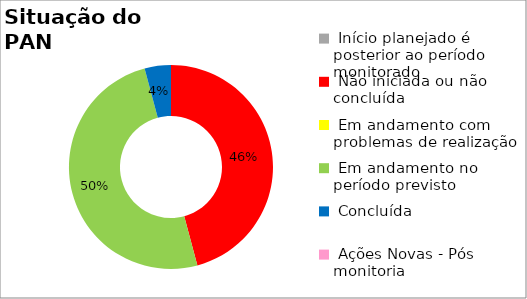
| Category | Series 0 |
|---|---|
|  Início planejado é posterior ao período monitorado | 0 |
|  Não iniciada ou não concluída | 0.458 |
|  Em andamento com problemas de realização | 0 |
|  Em andamento no período previsto  | 0.5 |
|  Concluída | 0.042 |
|  Ações Novas - Pós monitoria | 0 |